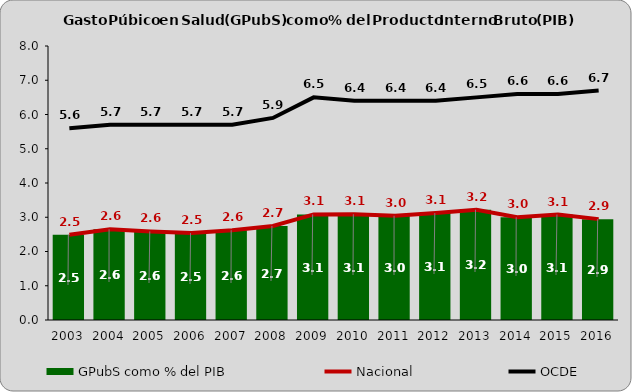
| Category | GPubS como % del PIB |
|---|---|
| 2003.0 | 2.488 |
| 2004.0 | 2.648 |
| 2005.0 | 2.586 |
| 2006.0 | 2.538 |
| 2007.0 | 2.622 |
| 2008.0 | 2.744 |
| 2009.0 | 3.082 |
| 2010.0 | 3.087 |
| 2011.0 | 3.043 |
| 2012.0 | 3.122 |
| 2013.0 | 3.222 |
| 2014.0 | 2.998 |
| 2015.0 | 3.08 |
| 2016.0 | 2.945 |